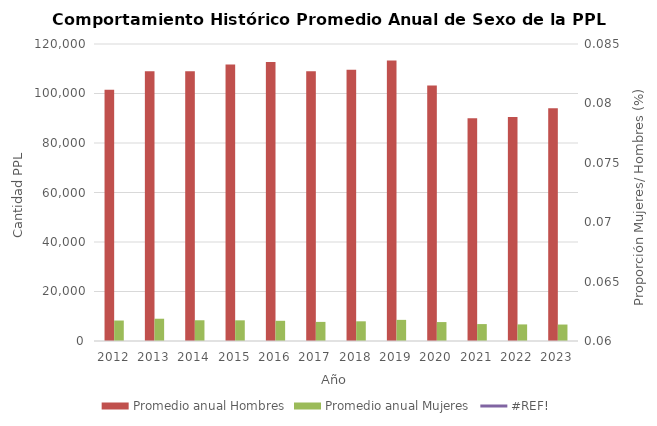
| Category | Promedio anual Hombres | Promedio anual Mujeres |
|---|---|---|
| 2012.0 | 101548.333 | 8273.75 |
| 2013.0 | 108988.333 | 8997.917 |
| 2014.0 | 109009.667 | 8379.417 |
| 2015.0 | 111689.083 | 8351 |
| 2016.0 | 112747 | 8167 |
| 2017.0 | 108939.917 | 7717.75 |
| 2018.0 | 109615.417 | 7954.167 |
| 2019.0 | 113308.833 | 8538.5 |
| 2020.0 | 103182.75 | 7647.583 |
| 2021.0 | 90002.917 | 6834.583 |
| 2022.0 | 90472.5 | 6703.417 |
| 2023.0 | 94008.364 | 6649 |